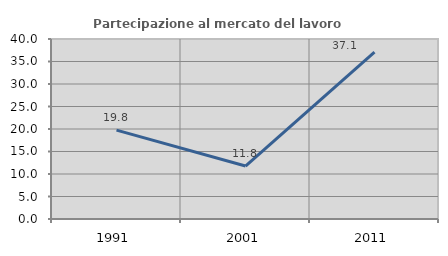
| Category | Partecipazione al mercato del lavoro  femminile |
|---|---|
| 1991.0 | 19.753 |
| 2001.0 | 11.765 |
| 2011.0 | 37.097 |